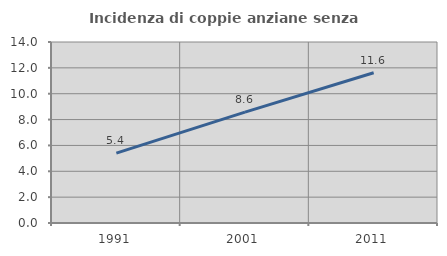
| Category | Incidenza di coppie anziane senza figli  |
|---|---|
| 1991.0 | 5.403 |
| 2001.0 | 8.574 |
| 2011.0 | 11.625 |